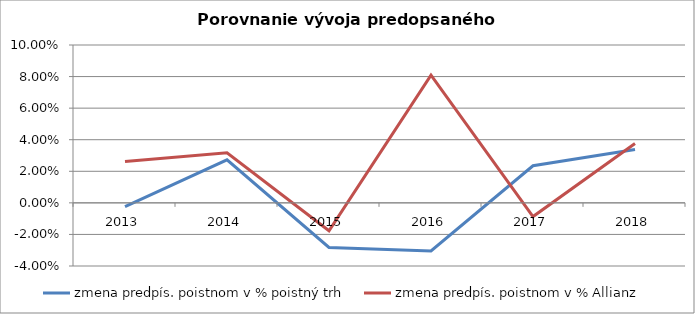
| Category | zmena predpís. poistnom v % poistný trh | zmena predpís. poistnom v % Allianz |
|---|---|---|
| 2013.0 | -0.002 | 0.026 |
| 2014.0 | 0.027 | 0.032 |
| 2015.0 | -0.028 | -0.018 |
| 2016.0 | -0.03 | 0.081 |
| 2017.0 | 0.023 | -0.009 |
| 2018.0 | 0.034 | 0.038 |